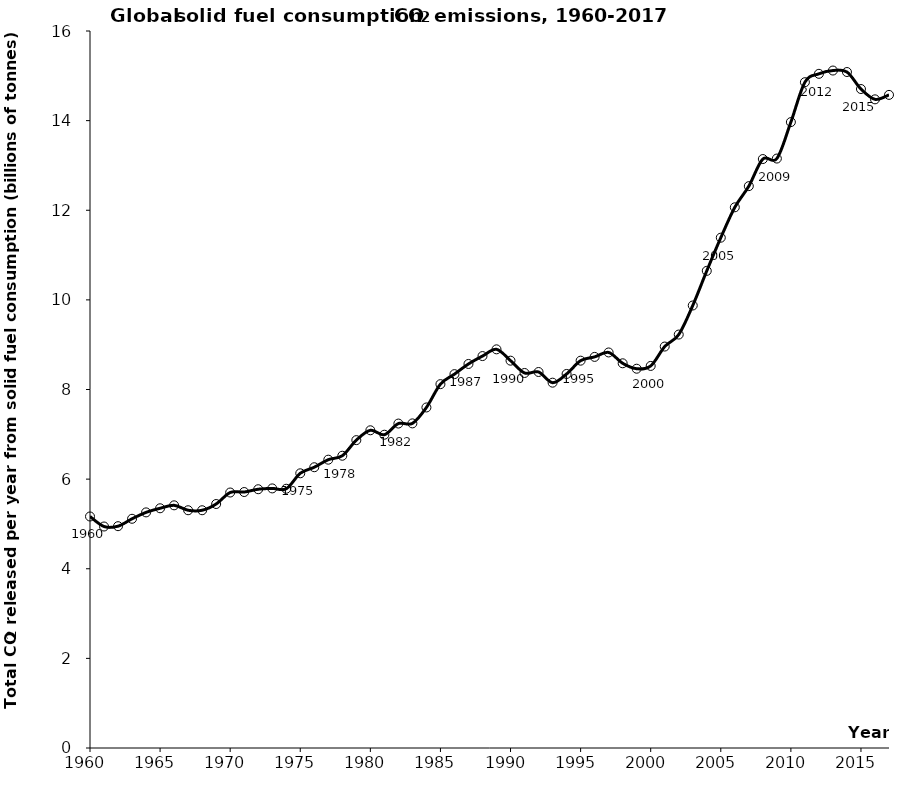
| Category | Series 0 |
|---|---|
| 1960.0 | 5.166 |
| 1961.0 | 4.943 |
| 1962.0 | 4.95 |
| 1963.0 | 5.115 |
| 1964.0 | 5.258 |
| 1965.0 | 5.349 |
| 1966.0 | 5.415 |
| 1967.0 | 5.305 |
| 1968.0 | 5.305 |
| 1969.0 | 5.445 |
| 1970.0 | 5.701 |
| 1971.0 | 5.712 |
| 1972.0 | 5.774 |
| 1973.0 | 5.793 |
| 1974.0 | 5.785 |
| 1975.0 | 6.13 |
| 1976.0 | 6.265 |
| 1977.0 | 6.434 |
| 1978.0 | 6.522 |
| 1979.0 | 6.87 |
| 1980.0 | 7.09 |
| 1981.0 | 6.991 |
| 1982.0 | 7.24 |
| 1983.0 | 7.244 |
| 1984.0 | 7.599 |
| 1985.0 | 8.119 |
| 1986.0 | 8.343 |
| 1987.0 | 8.57 |
| 1988.0 | 8.746 |
| 1989.0 | 8.896 |
| 1990.0 | 8.643 |
| 1991.0 | 8.369 |
| 1992.0 | 8.391 |
| 1993.0 | 8.152 |
| 1994.0 | 8.347 |
| 1995.0 | 8.643 |
| 1996.0 | 8.728 |
| 1997.0 | 8.827 |
| 1998.0 | 8.585 |
| 1999.0 | 8.464 |
| 2000.0 | 8.526 |
| 2001.0 | 8.958 |
| 2002.0 | 9.226 |
| 2003.0 | 9.874 |
| 2004.0 | 10.648 |
| 2005.0 | 11.388 |
| 2006.0 | 12.066 |
| 2007.0 | 12.538 |
| 2008.0 | 13.143 |
| 2009.0 | 13.154 |
| 2010.0 | 13.967 |
| 2011.0 | 14.858 |
| 2012.0 | 15.044 |
| 2013.0 | 15.118 |
| 2014.0 | 15.085 |
| 2015.0 | 14.705 |
| 2016.0 | 14.475 |
| 2017.0 | 14.574 |